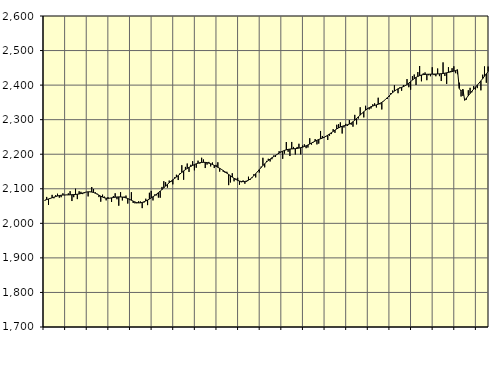
| Category | Piggar | Series 1 |
|---|---|---|
| nan | 2065.5 | 2067.15 |
| 1.0 | 2076.4 | 2068.86 |
| 1.0 | 2053.3 | 2070.5 |
| 1.0 | 2073.1 | 2072.2 |
| 1.0 | 2082.4 | 2073.96 |
| 1.0 | 2072.5 | 2075.69 |
| 1.0 | 2081.6 | 2077.54 |
| 1.0 | 2085.7 | 2079.04 |
| 1.0 | 2074.3 | 2080.4 |
| 1.0 | 2075.6 | 2081.34 |
| 1.0 | 2086.9 | 2081.89 |
| 1.0 | 2081.4 | 2082.15 |
| nan | 2082.7 | 2082.22 |
| 2.0 | 2086.7 | 2082.32 |
| 2.0 | 2093.1 | 2082.53 |
| 2.0 | 2064.5 | 2082.85 |
| 2.0 | 2075.7 | 2083.17 |
| 2.0 | 2100.1 | 2083.56 |
| 2.0 | 2070.1 | 2084.14 |
| 2.0 | 2092.8 | 2085 |
| 2.0 | 2091.2 | 2086.24 |
| 2.0 | 2084.6 | 2087.76 |
| 2.0 | 2087.3 | 2089.25 |
| 2.0 | 2090.8 | 2090.48 |
| nan | 2077.9 | 2091.2 |
| 3.0 | 2090.7 | 2091.23 |
| 3.0 | 2105.1 | 2090.53 |
| 3.0 | 2099.4 | 2089.14 |
| 3.0 | 2089.8 | 2087.1 |
| 3.0 | 2085.7 | 2084.52 |
| 3.0 | 2075.9 | 2081.61 |
| 3.0 | 2062.6 | 2078.7 |
| 3.0 | 2082.9 | 2076.05 |
| 3.0 | 2077.4 | 2073.99 |
| 3.0 | 2066.5 | 2072.72 |
| 3.0 | 2075.7 | 2072.34 |
| nan | 2073 | 2072.79 |
| 4.0 | 2061.8 | 2073.7 |
| 4.0 | 2078.7 | 2074.71 |
| 4.0 | 2087 | 2075.59 |
| 4.0 | 2069.7 | 2076.24 |
| 4.0 | 2051 | 2076.55 |
| 4.0 | 2090.1 | 2076.46 |
| 4.0 | 2066.2 | 2076.01 |
| 4.0 | 2077.3 | 2075.13 |
| 4.0 | 2080.3 | 2073.66 |
| 4.0 | 2057.2 | 2071.76 |
| 4.0 | 2067.3 | 2069.46 |
| nan | 2090.1 | 2066.82 |
| 5.0 | 2058.9 | 2064.19 |
| 5.0 | 2057.8 | 2061.87 |
| 5.0 | 2057.8 | 2060.1 |
| 5.0 | 2063.6 | 2059.19 |
| 5.0 | 2063.3 | 2059.38 |
| 5.0 | 2044 | 2060.51 |
| 5.0 | 2060.1 | 2062.31 |
| 5.0 | 2071.2 | 2064.61 |
| 5.0 | 2052.7 | 2067.28 |
| 5.0 | 2088.5 | 2070.24 |
| 5.0 | 2093.8 | 2073.48 |
| nan | 2066.3 | 2076.93 |
| 6.0 | 2083.7 | 2080.58 |
| 6.0 | 2081 | 2084.49 |
| 6.0 | 2074.5 | 2088.72 |
| 6.0 | 2074.1 | 2093.23 |
| 6.0 | 2105.4 | 2097.89 |
| 6.0 | 2121.9 | 2102.8 |
| 6.0 | 2119 | 2107.85 |
| 6.0 | 2103.4 | 2112.76 |
| 6.0 | 2123.8 | 2117.47 |
| 6.0 | 2119.5 | 2121.91 |
| 6.0 | 2112.8 | 2125.96 |
| nan | 2133.2 | 2129.88 |
| 7.0 | 2140.6 | 2134 |
| 7.0 | 2125.3 | 2138.3 |
| 7.0 | 2144.9 | 2142.81 |
| 7.0 | 2168.2 | 2147.34 |
| 7.0 | 2126.1 | 2151.6 |
| 7.0 | 2163.3 | 2155.42 |
| 7.0 | 2173.1 | 2158.83 |
| 7.0 | 2148.8 | 2161.93 |
| 7.0 | 2169.4 | 2164.85 |
| 7.0 | 2179.8 | 2167.52 |
| 7.0 | 2153.4 | 2170.02 |
| nan | 2160.9 | 2172.27 |
| 8.0 | 2181.3 | 2174.05 |
| 8.0 | 2173 | 2175.38 |
| 8.0 | 2189.8 | 2176.26 |
| 8.0 | 2184.8 | 2176.59 |
| 8.0 | 2160 | 2176.37 |
| 8.0 | 2170 | 2175.64 |
| 8.0 | 2177.7 | 2174.32 |
| 8.0 | 2164.7 | 2172.51 |
| 8.0 | 2176 | 2170.28 |
| 8.0 | 2160 | 2167.74 |
| 8.0 | 2169.1 | 2165.01 |
| nan | 2176.7 | 2162.18 |
| 9.0 | 2149.7 | 2159.23 |
| 9.0 | 2155.5 | 2156.06 |
| 9.0 | 2149.2 | 2152.64 |
| 9.0 | 2146.4 | 2148.99 |
| 9.0 | 2149.2 | 2145.22 |
| 9.0 | 2110.5 | 2141.38 |
| 9.0 | 2118.3 | 2137.52 |
| 9.0 | 2144.9 | 2133.76 |
| 9.0 | 2121.6 | 2130.21 |
| 9.0 | 2129.6 | 2127.02 |
| 9.0 | 2131.8 | 2124.36 |
| nan | 2111.7 | 2122.33 |
| 10.0 | 2118.8 | 2121.07 |
| 10.0 | 2124.2 | 2120.63 |
| 10.0 | 2114.6 | 2121.1 |
| 10.0 | 2120.6 | 2122.55 |
| 10.0 | 2134.9 | 2124.98 |
| 10.0 | 2126.3 | 2128.39 |
| 10.0 | 2130.9 | 2132.75 |
| 10.0 | 2142.3 | 2137.84 |
| 10.0 | 2132.9 | 2143.46 |
| 10.0 | 2150.5 | 2149.45 |
| 10.0 | 2146.9 | 2155.51 |
| nan | 2164.1 | 2161.44 |
| 11.0 | 2189.7 | 2167.16 |
| 11.0 | 2162 | 2172.55 |
| 11.0 | 2180.7 | 2177.44 |
| 11.0 | 2186.8 | 2181.87 |
| 11.0 | 2179 | 2185.97 |
| 11.0 | 2185.5 | 2189.71 |
| 11.0 | 2196.3 | 2193.2 |
| 11.0 | 2192 | 2196.6 |
| 11.0 | 2199.4 | 2199.95 |
| 11.0 | 2208.7 | 2203.17 |
| 11.0 | 2207.4 | 2206.21 |
| nan | 2186.7 | 2208.92 |
| 12.0 | 2201.9 | 2211.11 |
| 12.0 | 2235.3 | 2212.76 |
| 12.0 | 2207.1 | 2214.02 |
| 12.0 | 2194.8 | 2214.83 |
| 12.0 | 2235.5 | 2215.33 |
| 12.0 | 2221.1 | 2215.73 |
| 12.0 | 2199.2 | 2216.13 |
| 12.0 | 2221 | 2216.73 |
| 12.0 | 2230.3 | 2217.71 |
| 12.0 | 2199.6 | 2218.98 |
| 12.0 | 2225.1 | 2220.48 |
| nan | 2228.7 | 2222.28 |
| 13.0 | 2217.5 | 2224.38 |
| 13.0 | 2219.4 | 2226.81 |
| 13.0 | 2246.2 | 2229.49 |
| 13.0 | 2227.9 | 2232.4 |
| 13.0 | 2234.4 | 2235.31 |
| 13.0 | 2243.9 | 2238 |
| 13.0 | 2228.4 | 2240.48 |
| 13.0 | 2230.7 | 2242.71 |
| 13.0 | 2267.3 | 2244.67 |
| 13.0 | 2252.8 | 2246.71 |
| 13.0 | 2247.7 | 2249.12 |
| nan | 2252.8 | 2251.89 |
| 14.0 | 2241.2 | 2255.07 |
| 14.0 | 2253.5 | 2258.58 |
| 14.0 | 2258.3 | 2262.26 |
| 14.0 | 2272.5 | 2266.01 |
| 14.0 | 2261.9 | 2269.67 |
| 14.0 | 2285.2 | 2273.12 |
| 14.0 | 2287 | 2276.24 |
| 14.0 | 2292.1 | 2278.83 |
| 14.0 | 2259.9 | 2280.78 |
| 14.0 | 2277.3 | 2282.26 |
| 14.0 | 2287.9 | 2283.62 |
| nan | 2281.9 | 2285.2 |
| 15.0 | 2298.8 | 2287.35 |
| 15.0 | 2285.4 | 2290.3 |
| 15.0 | 2279.7 | 2294.04 |
| 15.0 | 2313.9 | 2298.41 |
| 15.0 | 2286.2 | 2303.27 |
| 15.0 | 2303.3 | 2308.32 |
| 15.0 | 2335.9 | 2313.3 |
| 15.0 | 2318.8 | 2318.21 |
| 15.0 | 2306.5 | 2322.98 |
| 15.0 | 2340.2 | 2327.48 |
| 15.0 | 2333.9 | 2331.46 |
| nan | 2329.6 | 2334.77 |
| 16.0 | 2332.2 | 2337.43 |
| 16.0 | 2344.5 | 2339.5 |
| 16.0 | 2347.3 | 2341.21 |
| 16.0 | 2335.2 | 2342.81 |
| 16.0 | 2363.5 | 2344.67 |
| 16.0 | 2344.4 | 2347.1 |
| 16.0 | 2329.6 | 2350.21 |
| 16.0 | 2353.3 | 2353.99 |
| 16.0 | 2358.5 | 2358.44 |
| 16.0 | 2359.8 | 2363.3 |
| 16.0 | 2365.8 | 2368.32 |
| nan | 2377 | 2373.43 |
| 17.0 | 2384.4 | 2378.32 |
| 17.0 | 2399.6 | 2382.61 |
| 17.0 | 2386.3 | 2386.25 |
| 17.0 | 2376.5 | 2389.2 |
| 17.0 | 2393.3 | 2391.49 |
| 17.0 | 2383.7 | 2393.51 |
| 17.0 | 2400.3 | 2395.73 |
| 17.0 | 2399.6 | 2398.43 |
| 17.0 | 2417.4 | 2401.75 |
| 17.0 | 2393.9 | 2405.71 |
| 17.0 | 2386.7 | 2410.13 |
| nan | 2426 | 2414.59 |
| 18.0 | 2430.7 | 2418.71 |
| 18.0 | 2400.4 | 2422.31 |
| 18.0 | 2437.7 | 2425.2 |
| 18.0 | 2455.3 | 2427.47 |
| 18.0 | 2411 | 2429.24 |
| 18.0 | 2434 | 2430.38 |
| 18.0 | 2436.7 | 2431 |
| 18.0 | 2414.2 | 2431.35 |
| 18.0 | 2428.6 | 2431.54 |
| 18.0 | 2425.7 | 2431.67 |
| 18.0 | 2451.7 | 2431.85 |
| nan | 2428.9 | 2431.98 |
| 19.0 | 2425.6 | 2432.06 |
| 19.0 | 2448.1 | 2432.28 |
| 19.0 | 2426 | 2432.6 |
| 19.0 | 2411.8 | 2432.98 |
| 19.0 | 2465.8 | 2433.58 |
| 19.0 | 2426.5 | 2434.51 |
| 19.0 | 2403.4 | 2435.62 |
| 19.0 | 2451.9 | 2436.8 |
| 19.0 | 2441 | 2437.97 |
| 19.0 | 2449 | 2439.13 |
| 19.0 | 2454.5 | 2440.4 |
| nan | 2434.5 | 2442.04 |
| 20.0 | 2431.6 | 2444.43 |
| 20.0 | 2407.1 | 2390.49 |
| 20.0 | 2367.1 | 2382.36 |
| 20.0 | 2368.7 | 2387.75 |
| 20.0 | 2358.5 | 2356.14 |
| 20.0 | 2358.1 | 2362.52 |
| 20.0 | 2385.1 | 2369.22 |
| 20.0 | 2392.1 | 2375.85 |
| 20.0 | 2379.2 | 2382.21 |
| 20.0 | 2397.2 | 2388.29 |
| 20.0 | 2386.9 | 2394.14 |
| nan | 2391.3 | 2400 |
| 21.0 | 2405.8 | 2406.05 |
| 21.0 | 2384.9 | 2412.32 |
| 21.0 | 2430.2 | 2418.83 |
| 21.0 | 2454.1 | 2425.65 |
| 21.0 | 2406.8 | 2432.52 |
| 21.0 | 2453.7 | 2439.14 |